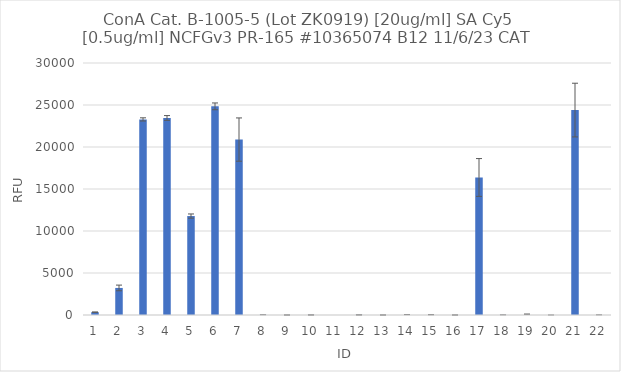
| Category | RFU |
|---|---|
| 0 | 338 |
| 1 | 3221.25 |
| 2 | 23284 |
| 3 | 23455.5 |
| 4 | 11779 |
| 5 | 24838.75 |
| 6 | 20885.5 |
| 7 | 14.5 |
| 8 | 1.25 |
| 9 | 7.5 |
| 10 | -68.75 |
| 11 | 14.25 |
| 12 | 1 |
| 13 | -15.5 |
| 14 | -28.25 |
| 15 | 1.75 |
| 16 | 16372.5 |
| 17 | 8.25 |
| 18 | -90.25 |
| 19 | 1 |
| 20 | 24396 |
| 21 | 1.5 |